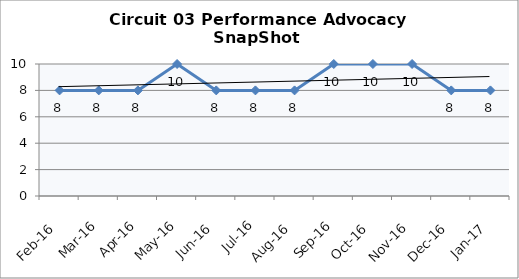
| Category | Circuit 03 |
|---|---|
| Feb-16 | 8 |
| Mar-16 | 8 |
| Apr-16 | 8 |
| May-16 | 10 |
| Jun-16 | 8 |
| Jul-16 | 8 |
| Aug-16 | 8 |
| Sep-16 | 10 |
| Oct-16 | 10 |
| Nov-16 | 10 |
| Dec-16 | 8 |
| Jan-17 | 8 |